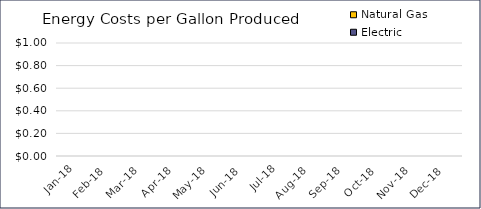
| Category | Electric | Natural Gas |
|---|---|---|
| 2018-01-01 | 0 | 0 |
| 2018-02-01 | 0 | 0 |
| 2018-03-01 | 0 | 0 |
| 2018-04-01 | 0 | 0 |
| 2018-05-01 | 0 | 0 |
| 2018-06-01 | 0 | 0 |
| 2018-07-01 | 0 | 0 |
| 2018-08-01 | 0 | 0 |
| 2018-09-01 | 0 | 0 |
| 2018-10-01 | 0 | 0 |
| 2018-11-01 | 0 | 0 |
| 2018-12-01 | 0 | 0 |